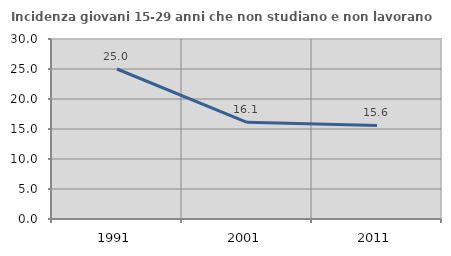
| Category | Incidenza giovani 15-29 anni che non studiano e non lavorano  |
|---|---|
| 1991.0 | 25 |
| 2001.0 | 16.118 |
| 2011.0 | 15.593 |